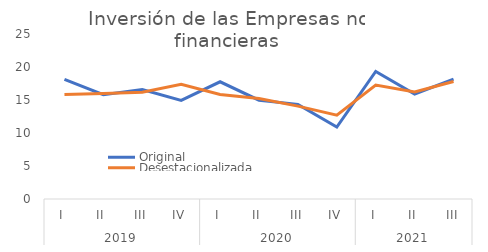
| Category | Original | Desestacionalizada |
|---|---|---|
| 0 | 18.136 | 15.823 |
| 1 | 15.803 | 15.994 |
| 2 | 16.591 | 16.184 |
| 3 | 14.95 | 17.367 |
| 4 | 17.76 | 15.837 |
| 5 | 14.965 | 15.232 |
| 6 | 14.337 | 14.068 |
| 7 | 10.891 | 12.713 |
| 8 | 19.317 | 17.261 |
| 9 | 15.908 | 16.218 |
| 10 | 18.173 | 17.804 |